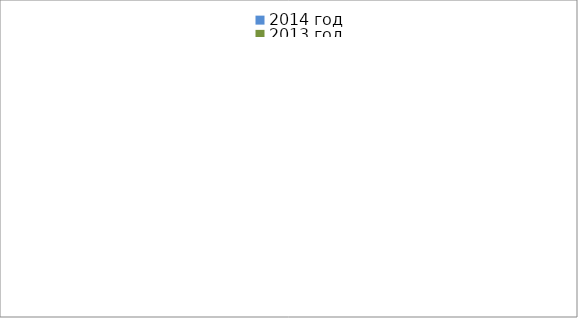
| Category | 2014 год | 2013 год |
|---|---|---|
|  - поджог | 23 | 35 |
|  - неосторожное обращение с огнём | 47 | 61 |
|  - НПТЭ электрооборудования | 19 | 22 |
|  - НПУ и Э печей | 73 | 59 |
|  - НПУ и Э транспортных средств | 62 | 55 |
|   -Шалость с огнем детей | 1 | 4 |
|  -НППБ при эксплуатации эл.приборов | 20 | 28 |
|  - курение | 21 | 12 |
| - прочие | 96 | 83 |
| - не установленные причины | 8 | 3 |